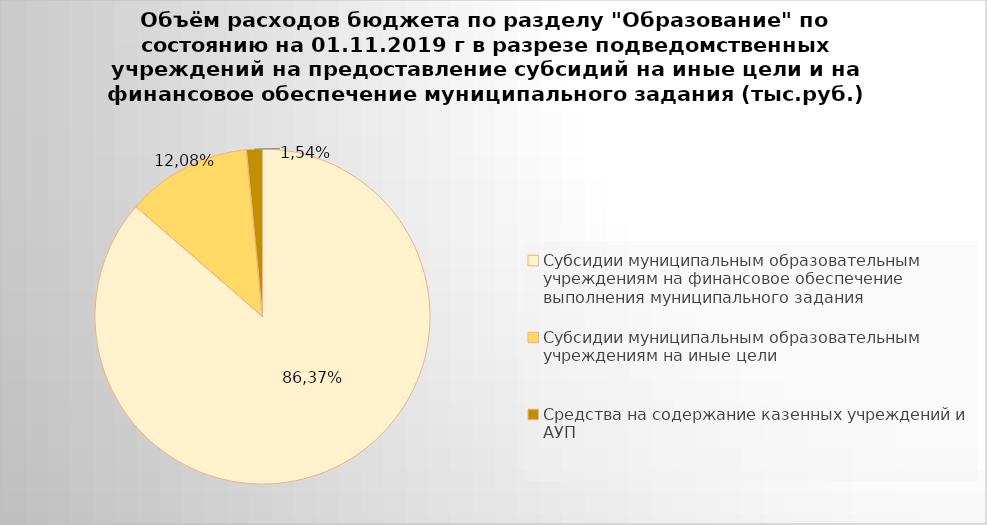
| Category | Series 0 |
|---|---|
| Субсидии муниципальным образовательным учреждениям на финансовое обеспечение выполнения муниципального задания | 4469379.18 |
| Субсидии муниципальным образовательным учреждениям на иные цели | 625311.68 |
| Средства на содержание казенных учреждений и АУП | 79699.3 |